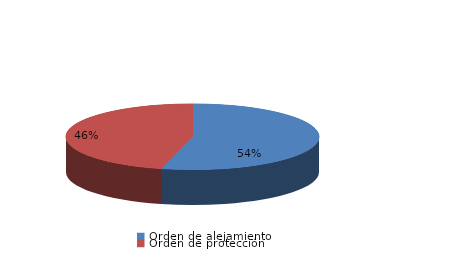
| Category | Series 0 |
|---|---|
| Orden de alejamiento | 61 |
| Orden de protección | 52 |